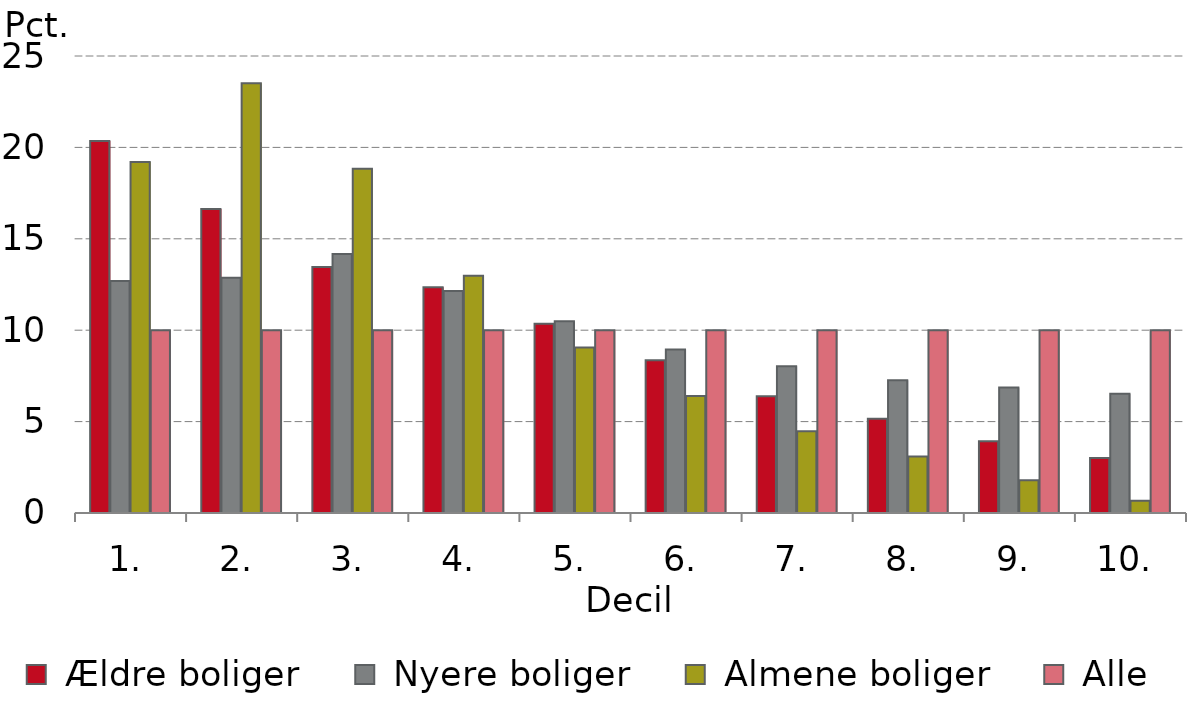
| Category |  Ældre boliger |  Nyere boliger |  Almene boliger |  Alle |
|---|---|---|---|---|
| 1. | 20.357 | 12.693 | 19.205 | 10 |
| 2. | 16.631 | 12.869 | 23.514 | 10 |
| 3. | 13.46 | 14.169 | 18.827 | 10 |
| 4. | 12.35 | 12.138 | 12.978 | 10 |
| 5. | 10.353 | 10.491 | 9.049 | 10 |
| 6. | 8.362 | 8.951 | 6.402 | 10 |
| 7. | 6.39 | 8.026 | 4.478 | 10 |
| 8. | 5.155 | 7.268 | 3.091 | 10 |
| 9. | 3.928 | 6.87 | 1.786 | 10 |
| 10. | 3.013 | 6.524 | 0.67 | 10 |